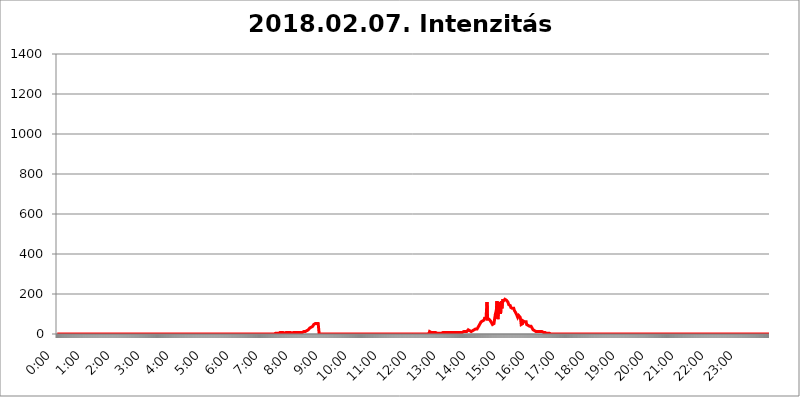
| Category | 2018.02.07. Intenzitás [W/m^2] |
|---|---|
| 0.0 | 0 |
| 0.0006944444444444445 | 0 |
| 0.001388888888888889 | 0 |
| 0.0020833333333333333 | 0 |
| 0.002777777777777778 | 0 |
| 0.003472222222222222 | 0 |
| 0.004166666666666667 | 0 |
| 0.004861111111111111 | 0 |
| 0.005555555555555556 | 0 |
| 0.0062499999999999995 | 0 |
| 0.006944444444444444 | 0 |
| 0.007638888888888889 | 0 |
| 0.008333333333333333 | 0 |
| 0.009027777777777779 | 0 |
| 0.009722222222222222 | 0 |
| 0.010416666666666666 | 0 |
| 0.011111111111111112 | 0 |
| 0.011805555555555555 | 0 |
| 0.012499999999999999 | 0 |
| 0.013194444444444444 | 0 |
| 0.013888888888888888 | 0 |
| 0.014583333333333332 | 0 |
| 0.015277777777777777 | 0 |
| 0.015972222222222224 | 0 |
| 0.016666666666666666 | 0 |
| 0.017361111111111112 | 0 |
| 0.018055555555555557 | 0 |
| 0.01875 | 0 |
| 0.019444444444444445 | 0 |
| 0.02013888888888889 | 0 |
| 0.020833333333333332 | 0 |
| 0.02152777777777778 | 0 |
| 0.022222222222222223 | 0 |
| 0.02291666666666667 | 0 |
| 0.02361111111111111 | 0 |
| 0.024305555555555556 | 0 |
| 0.024999999999999998 | 0 |
| 0.025694444444444447 | 0 |
| 0.02638888888888889 | 0 |
| 0.027083333333333334 | 0 |
| 0.027777777777777776 | 0 |
| 0.02847222222222222 | 0 |
| 0.029166666666666664 | 0 |
| 0.029861111111111113 | 0 |
| 0.030555555555555555 | 0 |
| 0.03125 | 0 |
| 0.03194444444444445 | 0 |
| 0.03263888888888889 | 0 |
| 0.03333333333333333 | 0 |
| 0.034027777777777775 | 0 |
| 0.034722222222222224 | 0 |
| 0.035416666666666666 | 0 |
| 0.036111111111111115 | 0 |
| 0.03680555555555556 | 0 |
| 0.0375 | 0 |
| 0.03819444444444444 | 0 |
| 0.03888888888888889 | 0 |
| 0.03958333333333333 | 0 |
| 0.04027777777777778 | 0 |
| 0.04097222222222222 | 0 |
| 0.041666666666666664 | 0 |
| 0.042361111111111106 | 0 |
| 0.04305555555555556 | 0 |
| 0.043750000000000004 | 0 |
| 0.044444444444444446 | 0 |
| 0.04513888888888889 | 0 |
| 0.04583333333333334 | 0 |
| 0.04652777777777778 | 0 |
| 0.04722222222222222 | 0 |
| 0.04791666666666666 | 0 |
| 0.04861111111111111 | 0 |
| 0.049305555555555554 | 0 |
| 0.049999999999999996 | 0 |
| 0.05069444444444445 | 0 |
| 0.051388888888888894 | 0 |
| 0.052083333333333336 | 0 |
| 0.05277777777777778 | 0 |
| 0.05347222222222222 | 0 |
| 0.05416666666666667 | 0 |
| 0.05486111111111111 | 0 |
| 0.05555555555555555 | 0 |
| 0.05625 | 0 |
| 0.05694444444444444 | 0 |
| 0.057638888888888885 | 0 |
| 0.05833333333333333 | 0 |
| 0.05902777777777778 | 0 |
| 0.059722222222222225 | 0 |
| 0.06041666666666667 | 0 |
| 0.061111111111111116 | 0 |
| 0.06180555555555556 | 0 |
| 0.0625 | 0 |
| 0.06319444444444444 | 0 |
| 0.06388888888888888 | 0 |
| 0.06458333333333334 | 0 |
| 0.06527777777777778 | 0 |
| 0.06597222222222222 | 0 |
| 0.06666666666666667 | 0 |
| 0.06736111111111111 | 0 |
| 0.06805555555555555 | 0 |
| 0.06874999999999999 | 0 |
| 0.06944444444444443 | 0 |
| 0.07013888888888889 | 0 |
| 0.07083333333333333 | 0 |
| 0.07152777777777779 | 0 |
| 0.07222222222222223 | 0 |
| 0.07291666666666667 | 0 |
| 0.07361111111111111 | 0 |
| 0.07430555555555556 | 0 |
| 0.075 | 0 |
| 0.07569444444444444 | 0 |
| 0.0763888888888889 | 0 |
| 0.07708333333333334 | 0 |
| 0.07777777777777778 | 0 |
| 0.07847222222222222 | 0 |
| 0.07916666666666666 | 0 |
| 0.0798611111111111 | 0 |
| 0.08055555555555556 | 0 |
| 0.08125 | 0 |
| 0.08194444444444444 | 0 |
| 0.08263888888888889 | 0 |
| 0.08333333333333333 | 0 |
| 0.08402777777777777 | 0 |
| 0.08472222222222221 | 0 |
| 0.08541666666666665 | 0 |
| 0.08611111111111112 | 0 |
| 0.08680555555555557 | 0 |
| 0.08750000000000001 | 0 |
| 0.08819444444444445 | 0 |
| 0.08888888888888889 | 0 |
| 0.08958333333333333 | 0 |
| 0.09027777777777778 | 0 |
| 0.09097222222222222 | 0 |
| 0.09166666666666667 | 0 |
| 0.09236111111111112 | 0 |
| 0.09305555555555556 | 0 |
| 0.09375 | 0 |
| 0.09444444444444444 | 0 |
| 0.09513888888888888 | 0 |
| 0.09583333333333333 | 0 |
| 0.09652777777777777 | 0 |
| 0.09722222222222222 | 0 |
| 0.09791666666666667 | 0 |
| 0.09861111111111111 | 0 |
| 0.09930555555555555 | 0 |
| 0.09999999999999999 | 0 |
| 0.10069444444444443 | 0 |
| 0.1013888888888889 | 0 |
| 0.10208333333333335 | 0 |
| 0.10277777777777779 | 0 |
| 0.10347222222222223 | 0 |
| 0.10416666666666667 | 0 |
| 0.10486111111111111 | 0 |
| 0.10555555555555556 | 0 |
| 0.10625 | 0 |
| 0.10694444444444444 | 0 |
| 0.1076388888888889 | 0 |
| 0.10833333333333334 | 0 |
| 0.10902777777777778 | 0 |
| 0.10972222222222222 | 0 |
| 0.1111111111111111 | 0 |
| 0.11180555555555556 | 0 |
| 0.11180555555555556 | 0 |
| 0.1125 | 0 |
| 0.11319444444444444 | 0 |
| 0.11388888888888889 | 0 |
| 0.11458333333333333 | 0 |
| 0.11527777777777777 | 0 |
| 0.11597222222222221 | 0 |
| 0.11666666666666665 | 0 |
| 0.1173611111111111 | 0 |
| 0.11805555555555557 | 0 |
| 0.11944444444444445 | 0 |
| 0.12013888888888889 | 0 |
| 0.12083333333333333 | 0 |
| 0.12152777777777778 | 0 |
| 0.12222222222222223 | 0 |
| 0.12291666666666667 | 0 |
| 0.12291666666666667 | 0 |
| 0.12361111111111112 | 0 |
| 0.12430555555555556 | 0 |
| 0.125 | 0 |
| 0.12569444444444444 | 0 |
| 0.12638888888888888 | 0 |
| 0.12708333333333333 | 0 |
| 0.16875 | 0 |
| 0.12847222222222224 | 0 |
| 0.12916666666666668 | 0 |
| 0.12986111111111112 | 0 |
| 0.13055555555555556 | 0 |
| 0.13125 | 0 |
| 0.13194444444444445 | 0 |
| 0.1326388888888889 | 0 |
| 0.13333333333333333 | 0 |
| 0.13402777777777777 | 0 |
| 0.13402777777777777 | 0 |
| 0.13472222222222222 | 0 |
| 0.13541666666666666 | 0 |
| 0.1361111111111111 | 0 |
| 0.13749999999999998 | 0 |
| 0.13819444444444443 | 0 |
| 0.1388888888888889 | 0 |
| 0.13958333333333334 | 0 |
| 0.14027777777777778 | 0 |
| 0.14097222222222222 | 0 |
| 0.14166666666666666 | 0 |
| 0.1423611111111111 | 0 |
| 0.14305555555555557 | 0 |
| 0.14375000000000002 | 0 |
| 0.14444444444444446 | 0 |
| 0.1451388888888889 | 0 |
| 0.1451388888888889 | 0 |
| 0.14652777777777778 | 0 |
| 0.14722222222222223 | 0 |
| 0.14791666666666667 | 0 |
| 0.1486111111111111 | 0 |
| 0.14930555555555555 | 0 |
| 0.15 | 0 |
| 0.15069444444444444 | 0 |
| 0.15138888888888888 | 0 |
| 0.15208333333333332 | 0 |
| 0.15277777777777776 | 0 |
| 0.15347222222222223 | 0 |
| 0.15416666666666667 | 0 |
| 0.15486111111111112 | 0 |
| 0.15555555555555556 | 0 |
| 0.15625 | 0 |
| 0.15694444444444444 | 0 |
| 0.15763888888888888 | 0 |
| 0.15833333333333333 | 0 |
| 0.15902777777777777 | 0 |
| 0.15972222222222224 | 0 |
| 0.16041666666666668 | 0 |
| 0.16111111111111112 | 0 |
| 0.16180555555555556 | 0 |
| 0.1625 | 0 |
| 0.16319444444444445 | 0 |
| 0.1638888888888889 | 0 |
| 0.16458333333333333 | 0 |
| 0.16527777777777777 | 0 |
| 0.16597222222222222 | 0 |
| 0.16666666666666666 | 0 |
| 0.1673611111111111 | 0 |
| 0.16805555555555554 | 0 |
| 0.16874999999999998 | 0 |
| 0.16944444444444443 | 0 |
| 0.17013888888888887 | 0 |
| 0.1708333333333333 | 0 |
| 0.17152777777777775 | 0 |
| 0.17222222222222225 | 0 |
| 0.1729166666666667 | 0 |
| 0.17361111111111113 | 0 |
| 0.17430555555555557 | 0 |
| 0.17500000000000002 | 0 |
| 0.17569444444444446 | 0 |
| 0.1763888888888889 | 0 |
| 0.17708333333333334 | 0 |
| 0.17777777777777778 | 0 |
| 0.17847222222222223 | 0 |
| 0.17916666666666667 | 0 |
| 0.1798611111111111 | 0 |
| 0.18055555555555555 | 0 |
| 0.18125 | 0 |
| 0.18194444444444444 | 0 |
| 0.1826388888888889 | 0 |
| 0.18333333333333335 | 0 |
| 0.1840277777777778 | 0 |
| 0.18472222222222223 | 0 |
| 0.18541666666666667 | 0 |
| 0.18611111111111112 | 0 |
| 0.18680555555555556 | 0 |
| 0.1875 | 0 |
| 0.18819444444444444 | 0 |
| 0.18888888888888888 | 0 |
| 0.18958333333333333 | 0 |
| 0.19027777777777777 | 0 |
| 0.1909722222222222 | 0 |
| 0.19166666666666665 | 0 |
| 0.19236111111111112 | 0 |
| 0.19305555555555554 | 0 |
| 0.19375 | 0 |
| 0.19444444444444445 | 0 |
| 0.1951388888888889 | 0 |
| 0.19583333333333333 | 0 |
| 0.19652777777777777 | 0 |
| 0.19722222222222222 | 0 |
| 0.19791666666666666 | 0 |
| 0.1986111111111111 | 0 |
| 0.19930555555555554 | 0 |
| 0.19999999999999998 | 0 |
| 0.20069444444444443 | 0 |
| 0.20138888888888887 | 0 |
| 0.2020833333333333 | 0 |
| 0.2027777777777778 | 0 |
| 0.2034722222222222 | 0 |
| 0.2041666666666667 | 0 |
| 0.20486111111111113 | 0 |
| 0.20555555555555557 | 0 |
| 0.20625000000000002 | 0 |
| 0.20694444444444446 | 0 |
| 0.2076388888888889 | 0 |
| 0.20833333333333334 | 0 |
| 0.20902777777777778 | 0 |
| 0.20972222222222223 | 0 |
| 0.21041666666666667 | 0 |
| 0.2111111111111111 | 0 |
| 0.21180555555555555 | 0 |
| 0.2125 | 0 |
| 0.21319444444444444 | 0 |
| 0.2138888888888889 | 0 |
| 0.21458333333333335 | 0 |
| 0.2152777777777778 | 0 |
| 0.21597222222222223 | 0 |
| 0.21666666666666667 | 0 |
| 0.21736111111111112 | 0 |
| 0.21805555555555556 | 0 |
| 0.21875 | 0 |
| 0.21944444444444444 | 0 |
| 0.22013888888888888 | 0 |
| 0.22083333333333333 | 0 |
| 0.22152777777777777 | 0 |
| 0.2222222222222222 | 0 |
| 0.22291666666666665 | 0 |
| 0.2236111111111111 | 0 |
| 0.22430555555555556 | 0 |
| 0.225 | 0 |
| 0.22569444444444445 | 0 |
| 0.2263888888888889 | 0 |
| 0.22708333333333333 | 0 |
| 0.22777777777777777 | 0 |
| 0.22847222222222222 | 0 |
| 0.22916666666666666 | 0 |
| 0.2298611111111111 | 0 |
| 0.23055555555555554 | 0 |
| 0.23124999999999998 | 0 |
| 0.23194444444444443 | 0 |
| 0.23263888888888887 | 0 |
| 0.2333333333333333 | 0 |
| 0.2340277777777778 | 0 |
| 0.2347222222222222 | 0 |
| 0.2354166666666667 | 0 |
| 0.23611111111111113 | 0 |
| 0.23680555555555557 | 0 |
| 0.23750000000000002 | 0 |
| 0.23819444444444446 | 0 |
| 0.2388888888888889 | 0 |
| 0.23958333333333334 | 0 |
| 0.24027777777777778 | 0 |
| 0.24097222222222223 | 0 |
| 0.24166666666666667 | 0 |
| 0.2423611111111111 | 0 |
| 0.24305555555555555 | 0 |
| 0.24375 | 0 |
| 0.24444444444444446 | 0 |
| 0.24513888888888888 | 0 |
| 0.24583333333333335 | 0 |
| 0.2465277777777778 | 0 |
| 0.24722222222222223 | 0 |
| 0.24791666666666667 | 0 |
| 0.24861111111111112 | 0 |
| 0.24930555555555556 | 0 |
| 0.25 | 0 |
| 0.25069444444444444 | 0 |
| 0.2513888888888889 | 0 |
| 0.2520833333333333 | 0 |
| 0.25277777777777777 | 0 |
| 0.2534722222222222 | 0 |
| 0.25416666666666665 | 0 |
| 0.2548611111111111 | 0 |
| 0.2555555555555556 | 0 |
| 0.25625000000000003 | 0 |
| 0.2569444444444445 | 0 |
| 0.2576388888888889 | 0 |
| 0.25833333333333336 | 0 |
| 0.2590277777777778 | 0 |
| 0.25972222222222224 | 0 |
| 0.2604166666666667 | 0 |
| 0.2611111111111111 | 0 |
| 0.26180555555555557 | 0 |
| 0.2625 | 0 |
| 0.26319444444444445 | 0 |
| 0.2638888888888889 | 0 |
| 0.26458333333333334 | 0 |
| 0.2652777777777778 | 0 |
| 0.2659722222222222 | 0 |
| 0.26666666666666666 | 0 |
| 0.2673611111111111 | 0 |
| 0.26805555555555555 | 0 |
| 0.26875 | 0 |
| 0.26944444444444443 | 0 |
| 0.2701388888888889 | 0 |
| 0.2708333333333333 | 0 |
| 0.27152777777777776 | 0 |
| 0.2722222222222222 | 0 |
| 0.27291666666666664 | 0 |
| 0.2736111111111111 | 0 |
| 0.2743055555555555 | 0 |
| 0.27499999999999997 | 0 |
| 0.27569444444444446 | 0 |
| 0.27638888888888885 | 0 |
| 0.27708333333333335 | 0 |
| 0.2777777777777778 | 0 |
| 0.27847222222222223 | 0 |
| 0.2791666666666667 | 0 |
| 0.2798611111111111 | 0 |
| 0.28055555555555556 | 0 |
| 0.28125 | 0 |
| 0.28194444444444444 | 0 |
| 0.2826388888888889 | 0 |
| 0.2833333333333333 | 0 |
| 0.28402777777777777 | 0 |
| 0.2847222222222222 | 0 |
| 0.28541666666666665 | 0 |
| 0.28611111111111115 | 0 |
| 0.28680555555555554 | 0 |
| 0.28750000000000003 | 0 |
| 0.2881944444444445 | 0 |
| 0.2888888888888889 | 0 |
| 0.28958333333333336 | 0 |
| 0.2902777777777778 | 0 |
| 0.29097222222222224 | 0 |
| 0.2916666666666667 | 0 |
| 0.2923611111111111 | 0 |
| 0.29305555555555557 | 0 |
| 0.29375 | 0 |
| 0.29444444444444445 | 0 |
| 0.2951388888888889 | 0 |
| 0.29583333333333334 | 0 |
| 0.2965277777777778 | 0 |
| 0.2972222222222222 | 0 |
| 0.29791666666666666 | 0 |
| 0.2986111111111111 | 0 |
| 0.29930555555555555 | 0 |
| 0.3 | 0 |
| 0.30069444444444443 | 0 |
| 0.3013888888888889 | 0 |
| 0.3020833333333333 | 0 |
| 0.30277777777777776 | 0 |
| 0.3034722222222222 | 0 |
| 0.30416666666666664 | 0 |
| 0.3048611111111111 | 0 |
| 0.3055555555555555 | 0 |
| 0.30624999999999997 | 3.525 |
| 0.3069444444444444 | 3.525 |
| 0.3076388888888889 | 3.525 |
| 0.30833333333333335 | 3.525 |
| 0.3090277777777778 | 3.525 |
| 0.30972222222222223 | 3.525 |
| 0.3104166666666667 | 3.525 |
| 0.3111111111111111 | 7.887 |
| 0.31180555555555556 | 7.887 |
| 0.3125 | 7.887 |
| 0.31319444444444444 | 7.887 |
| 0.3138888888888889 | 7.887 |
| 0.3145833333333333 | 7.887 |
| 0.31527777777777777 | 7.887 |
| 0.3159722222222222 | 7.887 |
| 0.31666666666666665 | 7.887 |
| 0.31736111111111115 | 7.887 |
| 0.31805555555555554 | 7.887 |
| 0.31875000000000003 | 3.525 |
| 0.3194444444444445 | 3.525 |
| 0.3201388888888889 | 7.887 |
| 0.32083333333333336 | 7.887 |
| 0.3215277777777778 | 7.887 |
| 0.32222222222222224 | 7.887 |
| 0.3229166666666667 | 7.887 |
| 0.3236111111111111 | 7.887 |
| 0.32430555555555557 | 7.887 |
| 0.325 | 7.887 |
| 0.32569444444444445 | 7.887 |
| 0.3263888888888889 | 7.887 |
| 0.32708333333333334 | 7.887 |
| 0.3277777777777778 | 3.525 |
| 0.3284722222222222 | 3.525 |
| 0.32916666666666666 | 3.525 |
| 0.3298611111111111 | 7.887 |
| 0.33055555555555555 | 7.887 |
| 0.33125 | 7.887 |
| 0.33194444444444443 | 7.887 |
| 0.3326388888888889 | 7.887 |
| 0.3333333333333333 | 7.887 |
| 0.3340277777777778 | 12.257 |
| 0.3347222222222222 | 7.887 |
| 0.3354166666666667 | 7.887 |
| 0.3361111111111111 | 7.887 |
| 0.3368055555555556 | 7.887 |
| 0.33749999999999997 | 7.887 |
| 0.33819444444444446 | 7.887 |
| 0.33888888888888885 | 7.887 |
| 0.33958333333333335 | 7.887 |
| 0.34027777777777773 | 7.887 |
| 0.34097222222222223 | 7.887 |
| 0.3416666666666666 | 7.887 |
| 0.3423611111111111 | 7.887 |
| 0.3430555555555555 | 7.887 |
| 0.34375 | 7.887 |
| 0.3444444444444445 | 12.257 |
| 0.3451388888888889 | 12.257 |
| 0.3458333333333334 | 12.257 |
| 0.34652777777777777 | 12.257 |
| 0.34722222222222227 | 12.257 |
| 0.34791666666666665 | 12.257 |
| 0.34861111111111115 | 12.257 |
| 0.34930555555555554 | 12.257 |
| 0.35000000000000003 | 16.636 |
| 0.3506944444444444 | 16.636 |
| 0.3513888888888889 | 16.636 |
| 0.3520833333333333 | 21.024 |
| 0.3527777777777778 | 21.024 |
| 0.3534722222222222 | 25.419 |
| 0.3541666666666667 | 29.823 |
| 0.3548611111111111 | 29.823 |
| 0.35555555555555557 | 34.234 |
| 0.35625 | 34.234 |
| 0.35694444444444445 | 34.234 |
| 0.3576388888888889 | 38.653 |
| 0.35833333333333334 | 38.653 |
| 0.3590277777777778 | 43.079 |
| 0.3597222222222222 | 47.511 |
| 0.36041666666666666 | 51.951 |
| 0.3611111111111111 | 51.951 |
| 0.36180555555555555 | 51.951 |
| 0.3625 | 51.951 |
| 0.36319444444444443 | 51.951 |
| 0.3638888888888889 | 51.951 |
| 0.3645833333333333 | 51.951 |
| 0.3652777777777778 | 51.951 |
| 0.3659722222222222 | 51.951 |
| 0.3666666666666667 | 51.951 |
| 0.3673611111111111 | 0 |
| 0.3680555555555556 | 0 |
| 0.36874999999999997 | 0 |
| 0.36944444444444446 | 0 |
| 0.37013888888888885 | 0 |
| 0.37083333333333335 | 0 |
| 0.37152777777777773 | 0 |
| 0.37222222222222223 | 0 |
| 0.3729166666666666 | 0 |
| 0.3736111111111111 | 0 |
| 0.3743055555555555 | 0 |
| 0.375 | 0 |
| 0.3756944444444445 | 0 |
| 0.3763888888888889 | 0 |
| 0.3770833333333334 | 0 |
| 0.37777777777777777 | 0 |
| 0.37847222222222227 | 0 |
| 0.37916666666666665 | 0 |
| 0.37986111111111115 | 0 |
| 0.38055555555555554 | 0 |
| 0.38125000000000003 | 0 |
| 0.3819444444444444 | 0 |
| 0.3826388888888889 | 0 |
| 0.3833333333333333 | 0 |
| 0.3840277777777778 | 0 |
| 0.3847222222222222 | 0 |
| 0.3854166666666667 | 0 |
| 0.3861111111111111 | 0 |
| 0.38680555555555557 | 0 |
| 0.3875 | 0 |
| 0.38819444444444445 | 0 |
| 0.3888888888888889 | 0 |
| 0.38958333333333334 | 0 |
| 0.3902777777777778 | 0 |
| 0.3909722222222222 | 0 |
| 0.39166666666666666 | 0 |
| 0.3923611111111111 | 0 |
| 0.39305555555555555 | 0 |
| 0.39375 | 0 |
| 0.39444444444444443 | 0 |
| 0.3951388888888889 | 0 |
| 0.3958333333333333 | 0 |
| 0.3965277777777778 | 0 |
| 0.3972222222222222 | 0 |
| 0.3979166666666667 | 0 |
| 0.3986111111111111 | 0 |
| 0.3993055555555556 | 0 |
| 0.39999999999999997 | 0 |
| 0.40069444444444446 | 0 |
| 0.40138888888888885 | 0 |
| 0.40208333333333335 | 0 |
| 0.40277777777777773 | 0 |
| 0.40347222222222223 | 0 |
| 0.4041666666666666 | 0 |
| 0.4048611111111111 | 0 |
| 0.4055555555555555 | 0 |
| 0.40625 | 0 |
| 0.4069444444444445 | 0 |
| 0.4076388888888889 | 0 |
| 0.4083333333333334 | 0 |
| 0.40902777777777777 | 0 |
| 0.40972222222222227 | 0 |
| 0.41041666666666665 | 0 |
| 0.41111111111111115 | 0 |
| 0.41180555555555554 | 0 |
| 0.41250000000000003 | 0 |
| 0.4131944444444444 | 0 |
| 0.4138888888888889 | 0 |
| 0.4145833333333333 | 0 |
| 0.4152777777777778 | 0 |
| 0.4159722222222222 | 0 |
| 0.4166666666666667 | 0 |
| 0.4173611111111111 | 0 |
| 0.41805555555555557 | 0 |
| 0.41875 | 0 |
| 0.41944444444444445 | 0 |
| 0.4201388888888889 | 0 |
| 0.42083333333333334 | 0 |
| 0.4215277777777778 | 0 |
| 0.4222222222222222 | 0 |
| 0.42291666666666666 | 0 |
| 0.4236111111111111 | 0 |
| 0.42430555555555555 | 0 |
| 0.425 | 0 |
| 0.42569444444444443 | 0 |
| 0.4263888888888889 | 0 |
| 0.4270833333333333 | 0 |
| 0.4277777777777778 | 0 |
| 0.4284722222222222 | 0 |
| 0.4291666666666667 | 0 |
| 0.4298611111111111 | 0 |
| 0.4305555555555556 | 0 |
| 0.43124999999999997 | 0 |
| 0.43194444444444446 | 0 |
| 0.43263888888888885 | 0 |
| 0.43333333333333335 | 0 |
| 0.43402777777777773 | 0 |
| 0.43472222222222223 | 0 |
| 0.4354166666666666 | 0 |
| 0.4361111111111111 | 0 |
| 0.4368055555555555 | 0 |
| 0.4375 | 0 |
| 0.4381944444444445 | 0 |
| 0.4388888888888889 | 0 |
| 0.4395833333333334 | 0 |
| 0.44027777777777777 | 0 |
| 0.44097222222222227 | 0 |
| 0.44166666666666665 | 0 |
| 0.44236111111111115 | 0 |
| 0.44305555555555554 | 0 |
| 0.44375000000000003 | 0 |
| 0.4444444444444444 | 0 |
| 0.4451388888888889 | 0 |
| 0.4458333333333333 | 0 |
| 0.4465277777777778 | 0 |
| 0.4472222222222222 | 0 |
| 0.4479166666666667 | 0 |
| 0.4486111111111111 | 0 |
| 0.44930555555555557 | 0 |
| 0.45 | 0 |
| 0.45069444444444445 | 0 |
| 0.4513888888888889 | 0 |
| 0.45208333333333334 | 0 |
| 0.4527777777777778 | 0 |
| 0.4534722222222222 | 0 |
| 0.45416666666666666 | 0 |
| 0.4548611111111111 | 0 |
| 0.45555555555555555 | 0 |
| 0.45625 | 0 |
| 0.45694444444444443 | 0 |
| 0.4576388888888889 | 0 |
| 0.4583333333333333 | 0 |
| 0.4590277777777778 | 0 |
| 0.4597222222222222 | 0 |
| 0.4604166666666667 | 0 |
| 0.4611111111111111 | 0 |
| 0.4618055555555556 | 0 |
| 0.46249999999999997 | 0 |
| 0.46319444444444446 | 0 |
| 0.46388888888888885 | 0 |
| 0.46458333333333335 | 0 |
| 0.46527777777777773 | 0 |
| 0.46597222222222223 | 0 |
| 0.4666666666666666 | 0 |
| 0.4673611111111111 | 0 |
| 0.4680555555555555 | 0 |
| 0.46875 | 0 |
| 0.4694444444444445 | 0 |
| 0.4701388888888889 | 0 |
| 0.4708333333333334 | 0 |
| 0.47152777777777777 | 0 |
| 0.47222222222222227 | 0 |
| 0.47291666666666665 | 0 |
| 0.47361111111111115 | 0 |
| 0.47430555555555554 | 0 |
| 0.47500000000000003 | 0 |
| 0.4756944444444444 | 0 |
| 0.4763888888888889 | 0 |
| 0.4770833333333333 | 0 |
| 0.4777777777777778 | 0 |
| 0.4784722222222222 | 0 |
| 0.4791666666666667 | 0 |
| 0.4798611111111111 | 0 |
| 0.48055555555555557 | 0 |
| 0.48125 | 0 |
| 0.48194444444444445 | 0 |
| 0.4826388888888889 | 0 |
| 0.48333333333333334 | 0 |
| 0.4840277777777778 | 0 |
| 0.4847222222222222 | 0 |
| 0.48541666666666666 | 0 |
| 0.4861111111111111 | 0 |
| 0.48680555555555555 | 0 |
| 0.4875 | 0 |
| 0.48819444444444443 | 0 |
| 0.4888888888888889 | 0 |
| 0.4895833333333333 | 0 |
| 0.4902777777777778 | 0 |
| 0.4909722222222222 | 0 |
| 0.4916666666666667 | 0 |
| 0.4923611111111111 | 0 |
| 0.4930555555555556 | 0 |
| 0.49374999999999997 | 0 |
| 0.49444444444444446 | 0 |
| 0.49513888888888885 | 0 |
| 0.49583333333333335 | 0 |
| 0.49652777777777773 | 0 |
| 0.49722222222222223 | 0 |
| 0.4979166666666666 | 0 |
| 0.4986111111111111 | 0 |
| 0.4993055555555555 | 0 |
| 0.5 | 0 |
| 0.5006944444444444 | 0 |
| 0.5013888888888889 | 0 |
| 0.5020833333333333 | 0 |
| 0.5027777777777778 | 0 |
| 0.5034722222222222 | 0 |
| 0.5041666666666667 | 0 |
| 0.5048611111111111 | 0 |
| 0.5055555555555555 | 0 |
| 0.50625 | 0 |
| 0.5069444444444444 | 0 |
| 0.5076388888888889 | 0 |
| 0.5083333333333333 | 0 |
| 0.5090277777777777 | 0 |
| 0.5097222222222222 | 0 |
| 0.5104166666666666 | 0 |
| 0.5111111111111112 | 0 |
| 0.5118055555555555 | 0 |
| 0.5125000000000001 | 0 |
| 0.5131944444444444 | 0 |
| 0.513888888888889 | 0 |
| 0.5145833333333333 | 0 |
| 0.5152777777777778 | 0 |
| 0.5159722222222222 | 0 |
| 0.5166666666666667 | 0 |
| 0.517361111111111 | 0 |
| 0.5180555555555556 | 0 |
| 0.5187499999999999 | 0 |
| 0.5194444444444445 | 0 |
| 0.5201388888888888 | 3.525 |
| 0.5208333333333334 | 3.525 |
| 0.5215277777777778 | 3.525 |
| 0.5222222222222223 | 12.257 |
| 0.5229166666666667 | 12.257 |
| 0.5236111111111111 | 12.257 |
| 0.5243055555555556 | 7.887 |
| 0.525 | 7.887 |
| 0.5256944444444445 | 7.887 |
| 0.5263888888888889 | 7.887 |
| 0.5270833333333333 | 7.887 |
| 0.5277777777777778 | 7.887 |
| 0.5284722222222222 | 7.887 |
| 0.5291666666666667 | 7.887 |
| 0.5298611111111111 | 7.887 |
| 0.5305555555555556 | 7.887 |
| 0.53125 | 7.887 |
| 0.5319444444444444 | 3.525 |
| 0.5326388888888889 | 3.525 |
| 0.5333333333333333 | 3.525 |
| 0.5340277777777778 | 3.525 |
| 0.5347222222222222 | 3.525 |
| 0.5354166666666667 | 3.525 |
| 0.5361111111111111 | 3.525 |
| 0.5368055555555555 | 3.525 |
| 0.5375 | 3.525 |
| 0.5381944444444444 | 3.525 |
| 0.5388888888888889 | 3.525 |
| 0.5395833333333333 | 3.525 |
| 0.5402777777777777 | 3.525 |
| 0.5409722222222222 | 7.887 |
| 0.5416666666666666 | 7.887 |
| 0.5423611111111112 | 7.887 |
| 0.5430555555555555 | 7.887 |
| 0.5437500000000001 | 7.887 |
| 0.5444444444444444 | 7.887 |
| 0.545138888888889 | 7.887 |
| 0.5458333333333333 | 7.887 |
| 0.5465277777777778 | 7.887 |
| 0.5472222222222222 | 7.887 |
| 0.5479166666666667 | 7.887 |
| 0.548611111111111 | 7.887 |
| 0.5493055555555556 | 7.887 |
| 0.5499999999999999 | 7.887 |
| 0.5506944444444445 | 7.887 |
| 0.5513888888888888 | 7.887 |
| 0.5520833333333334 | 7.887 |
| 0.5527777777777778 | 7.887 |
| 0.5534722222222223 | 7.887 |
| 0.5541666666666667 | 7.887 |
| 0.5548611111111111 | 7.887 |
| 0.5555555555555556 | 7.887 |
| 0.55625 | 7.887 |
| 0.5569444444444445 | 7.887 |
| 0.5576388888888889 | 7.887 |
| 0.5583333333333333 | 7.887 |
| 0.5590277777777778 | 7.887 |
| 0.5597222222222222 | 7.887 |
| 0.5604166666666667 | 7.887 |
| 0.5611111111111111 | 7.887 |
| 0.5618055555555556 | 7.887 |
| 0.5625 | 7.887 |
| 0.5631944444444444 | 7.887 |
| 0.5638888888888889 | 7.887 |
| 0.5645833333333333 | 7.887 |
| 0.5652777777777778 | 7.887 |
| 0.5659722222222222 | 7.887 |
| 0.5666666666666667 | 7.887 |
| 0.5673611111111111 | 7.887 |
| 0.5680555555555555 | 7.887 |
| 0.56875 | 7.887 |
| 0.5694444444444444 | 7.887 |
| 0.5701388888888889 | 12.257 |
| 0.5708333333333333 | 12.257 |
| 0.5715277777777777 | 12.257 |
| 0.5722222222222222 | 12.257 |
| 0.5729166666666666 | 12.257 |
| 0.5736111111111112 | 12.257 |
| 0.5743055555555555 | 12.257 |
| 0.5750000000000001 | 16.636 |
| 0.5756944444444444 | 16.636 |
| 0.576388888888889 | 21.024 |
| 0.5770833333333333 | 21.024 |
| 0.5777777777777778 | 21.024 |
| 0.5784722222222222 | 16.636 |
| 0.5791666666666667 | 16.636 |
| 0.579861111111111 | 16.636 |
| 0.5805555555555556 | 12.257 |
| 0.5812499999999999 | 12.257 |
| 0.5819444444444445 | 12.257 |
| 0.5826388888888888 | 16.636 |
| 0.5833333333333334 | 16.636 |
| 0.5840277777777778 | 21.024 |
| 0.5847222222222223 | 21.024 |
| 0.5854166666666667 | 21.024 |
| 0.5861111111111111 | 21.024 |
| 0.5868055555555556 | 25.419 |
| 0.5875 | 25.419 |
| 0.5881944444444445 | 25.419 |
| 0.5888888888888889 | 25.419 |
| 0.5895833333333333 | 29.823 |
| 0.5902777777777778 | 34.234 |
| 0.5909722222222222 | 38.653 |
| 0.5916666666666667 | 43.079 |
| 0.5923611111111111 | 47.511 |
| 0.5930555555555556 | 51.951 |
| 0.59375 | 56.398 |
| 0.5944444444444444 | 60.85 |
| 0.5951388888888889 | 65.31 |
| 0.5958333333333333 | 65.31 |
| 0.5965277777777778 | 65.31 |
| 0.5972222222222222 | 65.31 |
| 0.5979166666666667 | 65.31 |
| 0.5986111111111111 | 69.775 |
| 0.5993055555555555 | 78.722 |
| 0.6 | 83.205 |
| 0.6006944444444444 | 78.722 |
| 0.6013888888888889 | 78.722 |
| 0.6020833333333333 | 78.722 |
| 0.6027777777777777 | 160.056 |
| 0.6034722222222222 | 74.246 |
| 0.6041666666666666 | 74.246 |
| 0.6048611111111112 | 74.246 |
| 0.6055555555555555 | 74.246 |
| 0.6062500000000001 | 74.246 |
| 0.6069444444444444 | 69.775 |
| 0.607638888888889 | 65.31 |
| 0.6083333333333333 | 60.85 |
| 0.6090277777777778 | 56.398 |
| 0.6097222222222222 | 51.951 |
| 0.6104166666666667 | 47.511 |
| 0.611111111111111 | 47.511 |
| 0.6118055555555556 | 47.511 |
| 0.6124999999999999 | 51.951 |
| 0.6131944444444445 | 69.775 |
| 0.6138888888888888 | 74.246 |
| 0.6145833333333334 | 101.184 |
| 0.6152777777777778 | 110.201 |
| 0.6159722222222223 | 123.758 |
| 0.6166666666666667 | 164.605 |
| 0.6173611111111111 | 87.692 |
| 0.6180555555555556 | 74.246 |
| 0.61875 | 110.201 |
| 0.6194444444444445 | 119.235 |
| 0.6201388888888889 | 146.423 |
| 0.6208333333333333 | 160.056 |
| 0.6215277777777778 | 101.184 |
| 0.6222222222222222 | 114.716 |
| 0.6229166666666667 | 164.605 |
| 0.6236111111111111 | 128.284 |
| 0.6243055555555556 | 155.509 |
| 0.625 | 173.709 |
| 0.6256944444444444 | 164.605 |
| 0.6263888888888889 | 160.056 |
| 0.6270833333333333 | 164.605 |
| 0.6277777777777778 | 173.709 |
| 0.6284722222222222 | 173.709 |
| 0.6291666666666667 | 169.156 |
| 0.6298611111111111 | 169.156 |
| 0.6305555555555555 | 164.605 |
| 0.63125 | 164.605 |
| 0.6319444444444444 | 160.056 |
| 0.6326388888888889 | 155.509 |
| 0.6333333333333333 | 146.423 |
| 0.6340277777777777 | 146.423 |
| 0.6347222222222222 | 146.423 |
| 0.6354166666666666 | 141.884 |
| 0.6361111111111112 | 132.814 |
| 0.6368055555555555 | 137.347 |
| 0.6375000000000001 | 132.814 |
| 0.6381944444444444 | 128.284 |
| 0.638888888888889 | 128.284 |
| 0.6395833333333333 | 128.284 |
| 0.6402777777777778 | 128.284 |
| 0.6409722222222222 | 119.235 |
| 0.6416666666666667 | 114.716 |
| 0.642361111111111 | 110.201 |
| 0.6430555555555556 | 105.69 |
| 0.6437499999999999 | 101.184 |
| 0.6444444444444445 | 101.184 |
| 0.6451388888888888 | 96.682 |
| 0.6458333333333334 | 83.205 |
| 0.6465277777777778 | 87.692 |
| 0.6472222222222223 | 92.184 |
| 0.6479166666666667 | 87.692 |
| 0.6486111111111111 | 87.692 |
| 0.6493055555555556 | 83.205 |
| 0.65 | 69.775 |
| 0.6506944444444445 | 47.511 |
| 0.6513888888888889 | 47.511 |
| 0.6520833333333333 | 47.511 |
| 0.6527777777777778 | 51.951 |
| 0.6534722222222222 | 65.31 |
| 0.6541666666666667 | 65.31 |
| 0.6548611111111111 | 60.85 |
| 0.6555555555555556 | 60.85 |
| 0.65625 | 65.31 |
| 0.6569444444444444 | 60.85 |
| 0.6576388888888889 | 60.85 |
| 0.6583333333333333 | 47.511 |
| 0.6590277777777778 | 43.079 |
| 0.6597222222222222 | 43.079 |
| 0.6604166666666667 | 43.079 |
| 0.6611111111111111 | 38.653 |
| 0.6618055555555555 | 38.653 |
| 0.6625 | 38.653 |
| 0.6631944444444444 | 34.234 |
| 0.6638888888888889 | 34.234 |
| 0.6645833333333333 | 38.653 |
| 0.6652777777777777 | 34.234 |
| 0.6659722222222222 | 29.823 |
| 0.6666666666666666 | 25.419 |
| 0.6673611111111111 | 21.024 |
| 0.6680555555555556 | 21.024 |
| 0.6687500000000001 | 16.636 |
| 0.6694444444444444 | 16.636 |
| 0.6701388888888888 | 16.636 |
| 0.6708333333333334 | 12.257 |
| 0.6715277777777778 | 12.257 |
| 0.6722222222222222 | 12.257 |
| 0.6729166666666666 | 12.257 |
| 0.6736111111111112 | 12.257 |
| 0.6743055555555556 | 12.257 |
| 0.6749999999999999 | 12.257 |
| 0.6756944444444444 | 12.257 |
| 0.6763888888888889 | 12.257 |
| 0.6770833333333334 | 12.257 |
| 0.6777777777777777 | 12.257 |
| 0.6784722222222223 | 12.257 |
| 0.6791666666666667 | 12.257 |
| 0.6798611111111111 | 12.257 |
| 0.6805555555555555 | 12.257 |
| 0.68125 | 12.257 |
| 0.6819444444444445 | 7.887 |
| 0.6826388888888889 | 7.887 |
| 0.6833333333333332 | 7.887 |
| 0.6840277777777778 | 7.887 |
| 0.6847222222222222 | 3.525 |
| 0.6854166666666667 | 3.525 |
| 0.686111111111111 | 3.525 |
| 0.6868055555555556 | 3.525 |
| 0.6875 | 3.525 |
| 0.6881944444444444 | 3.525 |
| 0.688888888888889 | 3.525 |
| 0.6895833333333333 | 3.525 |
| 0.6902777777777778 | 3.525 |
| 0.6909722222222222 | 3.525 |
| 0.6916666666666668 | 0 |
| 0.6923611111111111 | 0 |
| 0.6930555555555555 | 0 |
| 0.69375 | 0 |
| 0.6944444444444445 | 0 |
| 0.6951388888888889 | 0 |
| 0.6958333333333333 | 0 |
| 0.6965277777777777 | 0 |
| 0.6972222222222223 | 0 |
| 0.6979166666666666 | 0 |
| 0.6986111111111111 | 0 |
| 0.6993055555555556 | 0 |
| 0.7000000000000001 | 0 |
| 0.7006944444444444 | 0 |
| 0.7013888888888888 | 0 |
| 0.7020833333333334 | 0 |
| 0.7027777777777778 | 0 |
| 0.7034722222222222 | 0 |
| 0.7041666666666666 | 0 |
| 0.7048611111111112 | 0 |
| 0.7055555555555556 | 0 |
| 0.7062499999999999 | 0 |
| 0.7069444444444444 | 0 |
| 0.7076388888888889 | 0 |
| 0.7083333333333334 | 0 |
| 0.7090277777777777 | 0 |
| 0.7097222222222223 | 0 |
| 0.7104166666666667 | 0 |
| 0.7111111111111111 | 0 |
| 0.7118055555555555 | 0 |
| 0.7125 | 0 |
| 0.7131944444444445 | 0 |
| 0.7138888888888889 | 0 |
| 0.7145833333333332 | 0 |
| 0.7152777777777778 | 0 |
| 0.7159722222222222 | 0 |
| 0.7166666666666667 | 0 |
| 0.717361111111111 | 0 |
| 0.7180555555555556 | 0 |
| 0.71875 | 0 |
| 0.7194444444444444 | 0 |
| 0.720138888888889 | 0 |
| 0.7208333333333333 | 0 |
| 0.7215277777777778 | 0 |
| 0.7222222222222222 | 0 |
| 0.7229166666666668 | 0 |
| 0.7236111111111111 | 0 |
| 0.7243055555555555 | 0 |
| 0.725 | 0 |
| 0.7256944444444445 | 0 |
| 0.7263888888888889 | 0 |
| 0.7270833333333333 | 0 |
| 0.7277777777777777 | 0 |
| 0.7284722222222223 | 0 |
| 0.7291666666666666 | 0 |
| 0.7298611111111111 | 0 |
| 0.7305555555555556 | 0 |
| 0.7312500000000001 | 0 |
| 0.7319444444444444 | 0 |
| 0.7326388888888888 | 0 |
| 0.7333333333333334 | 0 |
| 0.7340277777777778 | 0 |
| 0.7347222222222222 | 0 |
| 0.7354166666666666 | 0 |
| 0.7361111111111112 | 0 |
| 0.7368055555555556 | 0 |
| 0.7374999999999999 | 0 |
| 0.7381944444444444 | 0 |
| 0.7388888888888889 | 0 |
| 0.7395833333333334 | 0 |
| 0.7402777777777777 | 0 |
| 0.7409722222222223 | 0 |
| 0.7416666666666667 | 0 |
| 0.7423611111111111 | 0 |
| 0.7430555555555555 | 0 |
| 0.74375 | 0 |
| 0.7444444444444445 | 0 |
| 0.7451388888888889 | 0 |
| 0.7458333333333332 | 0 |
| 0.7465277777777778 | 0 |
| 0.7472222222222222 | 0 |
| 0.7479166666666667 | 0 |
| 0.748611111111111 | 0 |
| 0.7493055555555556 | 0 |
| 0.75 | 0 |
| 0.7506944444444444 | 0 |
| 0.751388888888889 | 0 |
| 0.7520833333333333 | 0 |
| 0.7527777777777778 | 0 |
| 0.7534722222222222 | 0 |
| 0.7541666666666668 | 0 |
| 0.7548611111111111 | 0 |
| 0.7555555555555555 | 0 |
| 0.75625 | 0 |
| 0.7569444444444445 | 0 |
| 0.7576388888888889 | 0 |
| 0.7583333333333333 | 0 |
| 0.7590277777777777 | 0 |
| 0.7597222222222223 | 0 |
| 0.7604166666666666 | 0 |
| 0.7611111111111111 | 0 |
| 0.7618055555555556 | 0 |
| 0.7625000000000001 | 0 |
| 0.7631944444444444 | 0 |
| 0.7638888888888888 | 0 |
| 0.7645833333333334 | 0 |
| 0.7652777777777778 | 0 |
| 0.7659722222222222 | 0 |
| 0.7666666666666666 | 0 |
| 0.7673611111111112 | 0 |
| 0.7680555555555556 | 0 |
| 0.7687499999999999 | 0 |
| 0.7694444444444444 | 0 |
| 0.7701388888888889 | 0 |
| 0.7708333333333334 | 0 |
| 0.7715277777777777 | 0 |
| 0.7722222222222223 | 0 |
| 0.7729166666666667 | 0 |
| 0.7736111111111111 | 0 |
| 0.7743055555555555 | 0 |
| 0.775 | 0 |
| 0.7756944444444445 | 0 |
| 0.7763888888888889 | 0 |
| 0.7770833333333332 | 0 |
| 0.7777777777777778 | 0 |
| 0.7784722222222222 | 0 |
| 0.7791666666666667 | 0 |
| 0.779861111111111 | 0 |
| 0.7805555555555556 | 0 |
| 0.78125 | 0 |
| 0.7819444444444444 | 0 |
| 0.782638888888889 | 0 |
| 0.7833333333333333 | 0 |
| 0.7840277777777778 | 0 |
| 0.7847222222222222 | 0 |
| 0.7854166666666668 | 0 |
| 0.7861111111111111 | 0 |
| 0.7868055555555555 | 0 |
| 0.7875 | 0 |
| 0.7881944444444445 | 0 |
| 0.7888888888888889 | 0 |
| 0.7895833333333333 | 0 |
| 0.7902777777777777 | 0 |
| 0.7909722222222223 | 0 |
| 0.7916666666666666 | 0 |
| 0.7923611111111111 | 0 |
| 0.7930555555555556 | 0 |
| 0.7937500000000001 | 0 |
| 0.7944444444444444 | 0 |
| 0.7951388888888888 | 0 |
| 0.7958333333333334 | 0 |
| 0.7965277777777778 | 0 |
| 0.7972222222222222 | 0 |
| 0.7979166666666666 | 0 |
| 0.7986111111111112 | 0 |
| 0.7993055555555556 | 0 |
| 0.7999999999999999 | 0 |
| 0.8006944444444444 | 0 |
| 0.8013888888888889 | 0 |
| 0.8020833333333334 | 0 |
| 0.8027777777777777 | 0 |
| 0.8034722222222223 | 0 |
| 0.8041666666666667 | 0 |
| 0.8048611111111111 | 0 |
| 0.8055555555555555 | 0 |
| 0.80625 | 0 |
| 0.8069444444444445 | 0 |
| 0.8076388888888889 | 0 |
| 0.8083333333333332 | 0 |
| 0.8090277777777778 | 0 |
| 0.8097222222222222 | 0 |
| 0.8104166666666667 | 0 |
| 0.811111111111111 | 0 |
| 0.8118055555555556 | 0 |
| 0.8125 | 0 |
| 0.8131944444444444 | 0 |
| 0.813888888888889 | 0 |
| 0.8145833333333333 | 0 |
| 0.8152777777777778 | 0 |
| 0.8159722222222222 | 0 |
| 0.8166666666666668 | 0 |
| 0.8173611111111111 | 0 |
| 0.8180555555555555 | 0 |
| 0.81875 | 0 |
| 0.8194444444444445 | 0 |
| 0.8201388888888889 | 0 |
| 0.8208333333333333 | 0 |
| 0.8215277777777777 | 0 |
| 0.8222222222222223 | 0 |
| 0.8229166666666666 | 0 |
| 0.8236111111111111 | 0 |
| 0.8243055555555556 | 0 |
| 0.8250000000000001 | 0 |
| 0.8256944444444444 | 0 |
| 0.8263888888888888 | 0 |
| 0.8270833333333334 | 0 |
| 0.8277777777777778 | 0 |
| 0.8284722222222222 | 0 |
| 0.8291666666666666 | 0 |
| 0.8298611111111112 | 0 |
| 0.8305555555555556 | 0 |
| 0.8312499999999999 | 0 |
| 0.8319444444444444 | 0 |
| 0.8326388888888889 | 0 |
| 0.8333333333333334 | 0 |
| 0.8340277777777777 | 0 |
| 0.8347222222222223 | 0 |
| 0.8354166666666667 | 0 |
| 0.8361111111111111 | 0 |
| 0.8368055555555555 | 0 |
| 0.8375 | 0 |
| 0.8381944444444445 | 0 |
| 0.8388888888888889 | 0 |
| 0.8395833333333332 | 0 |
| 0.8402777777777778 | 0 |
| 0.8409722222222222 | 0 |
| 0.8416666666666667 | 0 |
| 0.842361111111111 | 0 |
| 0.8430555555555556 | 0 |
| 0.84375 | 0 |
| 0.8444444444444444 | 0 |
| 0.845138888888889 | 0 |
| 0.8458333333333333 | 0 |
| 0.8465277777777778 | 0 |
| 0.8472222222222222 | 0 |
| 0.8479166666666668 | 0 |
| 0.8486111111111111 | 0 |
| 0.8493055555555555 | 0 |
| 0.85 | 0 |
| 0.8506944444444445 | 0 |
| 0.8513888888888889 | 0 |
| 0.8520833333333333 | 0 |
| 0.8527777777777777 | 0 |
| 0.8534722222222223 | 0 |
| 0.8541666666666666 | 0 |
| 0.8548611111111111 | 0 |
| 0.8555555555555556 | 0 |
| 0.8562500000000001 | 0 |
| 0.8569444444444444 | 0 |
| 0.8576388888888888 | 0 |
| 0.8583333333333334 | 0 |
| 0.8590277777777778 | 0 |
| 0.8597222222222222 | 0 |
| 0.8604166666666666 | 0 |
| 0.8611111111111112 | 0 |
| 0.8618055555555556 | 0 |
| 0.8624999999999999 | 0 |
| 0.8631944444444444 | 0 |
| 0.8638888888888889 | 0 |
| 0.8645833333333334 | 0 |
| 0.8652777777777777 | 0 |
| 0.8659722222222223 | 0 |
| 0.8666666666666667 | 0 |
| 0.8673611111111111 | 0 |
| 0.8680555555555555 | 0 |
| 0.86875 | 0 |
| 0.8694444444444445 | 0 |
| 0.8701388888888889 | 0 |
| 0.8708333333333332 | 0 |
| 0.8715277777777778 | 0 |
| 0.8722222222222222 | 0 |
| 0.8729166666666667 | 0 |
| 0.873611111111111 | 0 |
| 0.8743055555555556 | 0 |
| 0.875 | 0 |
| 0.8756944444444444 | 0 |
| 0.876388888888889 | 0 |
| 0.8770833333333333 | 0 |
| 0.8777777777777778 | 0 |
| 0.8784722222222222 | 0 |
| 0.8791666666666668 | 0 |
| 0.8798611111111111 | 0 |
| 0.8805555555555555 | 0 |
| 0.88125 | 0 |
| 0.8819444444444445 | 0 |
| 0.8826388888888889 | 0 |
| 0.8833333333333333 | 0 |
| 0.8840277777777777 | 0 |
| 0.8847222222222223 | 0 |
| 0.8854166666666666 | 0 |
| 0.8861111111111111 | 0 |
| 0.8868055555555556 | 0 |
| 0.8875000000000001 | 0 |
| 0.8881944444444444 | 0 |
| 0.8888888888888888 | 0 |
| 0.8895833333333334 | 0 |
| 0.8902777777777778 | 0 |
| 0.8909722222222222 | 0 |
| 0.8916666666666666 | 0 |
| 0.8923611111111112 | 0 |
| 0.8930555555555556 | 0 |
| 0.8937499999999999 | 0 |
| 0.8944444444444444 | 0 |
| 0.8951388888888889 | 0 |
| 0.8958333333333334 | 0 |
| 0.8965277777777777 | 0 |
| 0.8972222222222223 | 0 |
| 0.8979166666666667 | 0 |
| 0.8986111111111111 | 0 |
| 0.8993055555555555 | 0 |
| 0.9 | 0 |
| 0.9006944444444445 | 0 |
| 0.9013888888888889 | 0 |
| 0.9020833333333332 | 0 |
| 0.9027777777777778 | 0 |
| 0.9034722222222222 | 0 |
| 0.9041666666666667 | 0 |
| 0.904861111111111 | 0 |
| 0.9055555555555556 | 0 |
| 0.90625 | 0 |
| 0.9069444444444444 | 0 |
| 0.907638888888889 | 0 |
| 0.9083333333333333 | 0 |
| 0.9090277777777778 | 0 |
| 0.9097222222222222 | 0 |
| 0.9104166666666668 | 0 |
| 0.9111111111111111 | 0 |
| 0.9118055555555555 | 0 |
| 0.9125 | 0 |
| 0.9131944444444445 | 0 |
| 0.9138888888888889 | 0 |
| 0.9145833333333333 | 0 |
| 0.9152777777777777 | 0 |
| 0.9159722222222223 | 0 |
| 0.9166666666666666 | 0 |
| 0.9173611111111111 | 0 |
| 0.9180555555555556 | 0 |
| 0.9187500000000001 | 0 |
| 0.9194444444444444 | 0 |
| 0.9201388888888888 | 0 |
| 0.9208333333333334 | 0 |
| 0.9215277777777778 | 0 |
| 0.9222222222222222 | 0 |
| 0.9229166666666666 | 0 |
| 0.9236111111111112 | 0 |
| 0.9243055555555556 | 0 |
| 0.9249999999999999 | 0 |
| 0.9256944444444444 | 0 |
| 0.9263888888888889 | 0 |
| 0.9270833333333334 | 0 |
| 0.9277777777777777 | 0 |
| 0.9284722222222223 | 0 |
| 0.9291666666666667 | 0 |
| 0.9298611111111111 | 0 |
| 0.9305555555555555 | 0 |
| 0.93125 | 0 |
| 0.9319444444444445 | 0 |
| 0.9326388888888889 | 0 |
| 0.9333333333333332 | 0 |
| 0.9340277777777778 | 0 |
| 0.9347222222222222 | 0 |
| 0.9354166666666667 | 0 |
| 0.936111111111111 | 0 |
| 0.9368055555555556 | 0 |
| 0.9375 | 0 |
| 0.9381944444444444 | 0 |
| 0.938888888888889 | 0 |
| 0.9395833333333333 | 0 |
| 0.9402777777777778 | 0 |
| 0.9409722222222222 | 0 |
| 0.9416666666666668 | 0 |
| 0.9423611111111111 | 0 |
| 0.9430555555555555 | 0 |
| 0.94375 | 0 |
| 0.9444444444444445 | 0 |
| 0.9451388888888889 | 0 |
| 0.9458333333333333 | 0 |
| 0.9465277777777777 | 0 |
| 0.9472222222222223 | 0 |
| 0.9479166666666666 | 0 |
| 0.9486111111111111 | 0 |
| 0.9493055555555556 | 0 |
| 0.9500000000000001 | 0 |
| 0.9506944444444444 | 0 |
| 0.9513888888888888 | 0 |
| 0.9520833333333334 | 0 |
| 0.9527777777777778 | 0 |
| 0.9534722222222222 | 0 |
| 0.9541666666666666 | 0 |
| 0.9548611111111112 | 0 |
| 0.9555555555555556 | 0 |
| 0.9562499999999999 | 0 |
| 0.9569444444444444 | 0 |
| 0.9576388888888889 | 0 |
| 0.9583333333333334 | 0 |
| 0.9590277777777777 | 0 |
| 0.9597222222222223 | 0 |
| 0.9604166666666667 | 0 |
| 0.9611111111111111 | 0 |
| 0.9618055555555555 | 0 |
| 0.9625 | 0 |
| 0.9631944444444445 | 0 |
| 0.9638888888888889 | 0 |
| 0.9645833333333332 | 0 |
| 0.9652777777777778 | 0 |
| 0.9659722222222222 | 0 |
| 0.9666666666666667 | 0 |
| 0.967361111111111 | 0 |
| 0.9680555555555556 | 0 |
| 0.96875 | 0 |
| 0.9694444444444444 | 0 |
| 0.970138888888889 | 0 |
| 0.9708333333333333 | 0 |
| 0.9715277777777778 | 0 |
| 0.9722222222222222 | 0 |
| 0.9729166666666668 | 0 |
| 0.9736111111111111 | 0 |
| 0.9743055555555555 | 0 |
| 0.975 | 0 |
| 0.9756944444444445 | 0 |
| 0.9763888888888889 | 0 |
| 0.9770833333333333 | 0 |
| 0.9777777777777777 | 0 |
| 0.9784722222222223 | 0 |
| 0.9791666666666666 | 0 |
| 0.9798611111111111 | 0 |
| 0.9805555555555556 | 0 |
| 0.9812500000000001 | 0 |
| 0.9819444444444444 | 0 |
| 0.9826388888888888 | 0 |
| 0.9833333333333334 | 0 |
| 0.9840277777777778 | 0 |
| 0.9847222222222222 | 0 |
| 0.9854166666666666 | 0 |
| 0.9861111111111112 | 0 |
| 0.9868055555555556 | 0 |
| 0.9874999999999999 | 0 |
| 0.9881944444444444 | 0 |
| 0.9888888888888889 | 0 |
| 0.9895833333333334 | 0 |
| 0.9902777777777777 | 0 |
| 0.9909722222222223 | 0 |
| 0.9916666666666667 | 0 |
| 0.9923611111111111 | 0 |
| 0.9930555555555555 | 0 |
| 0.99375 | 0 |
| 0.9944444444444445 | 0 |
| 0.9951388888888889 | 0 |
| 0.9958333333333332 | 0 |
| 0.9965277777777778 | 0 |
| 0.9972222222222222 | 0 |
| 0.9979166666666667 | 0 |
| 0.998611111111111 | 0 |
| 0.9993055555555556 | 0 |